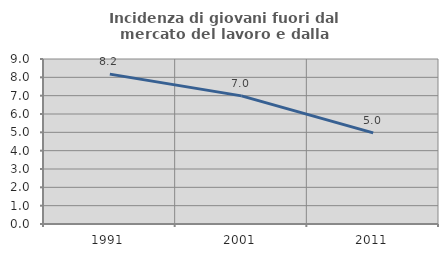
| Category | Incidenza di giovani fuori dal mercato del lavoro e dalla formazione  |
|---|---|
| 1991.0 | 8.175 |
| 2001.0 | 6.988 |
| 2011.0 | 4.969 |